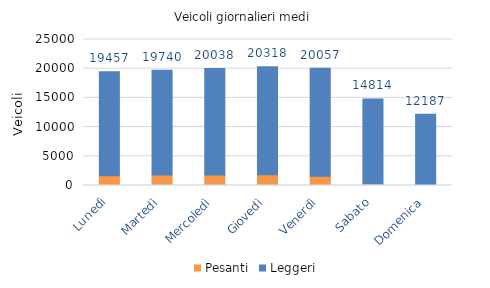
| Category | Pesanti | Leggeri |
|---|---|---|
| Lunedì | 1688 | 17769 |
| Martedì | 1810 | 17930 |
| Mercoledì | 1809 | 18229 |
| Giovedì | 1852 | 18466 |
| Venerdì | 1605 | 18452 |
| Sabato | 304 | 14510 |
| Domenica | 98 | 12089 |